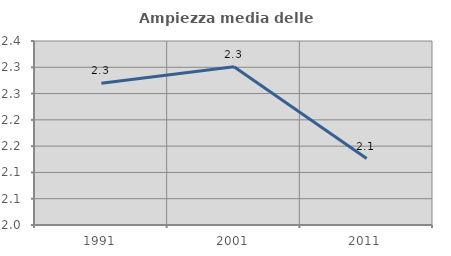
| Category | Ampiezza media delle famiglie |
|---|---|
| 1991.0 | 2.27 |
| 2001.0 | 2.301 |
| 2011.0 | 2.126 |